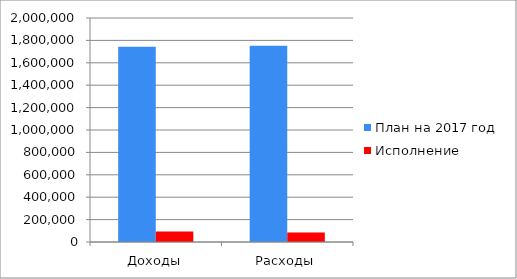
| Category | План на 2017 год | Исполнение |
|---|---|---|
| Доходы | 1742945.2 | 94358.1 |
| Расходы | 1752635 | 83811 |